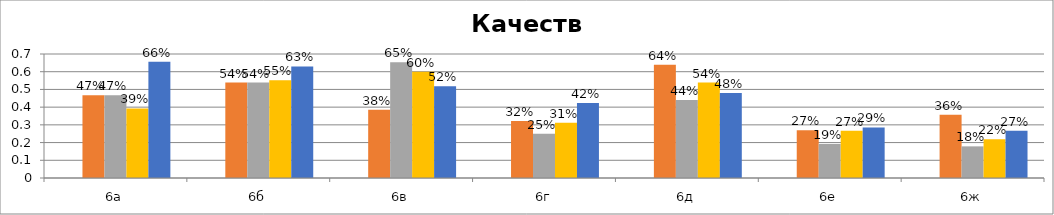
| Category | Series 0 | Series 1 | Series 2 | Series 3 | Series 4 |
|---|---|---|---|---|---|
| 6а |  | 0.467 | 0.467 | 0.393 | 0.656 |
| 6б |  | 0.538 | 0.538 | 0.552 | 0.63 |
| 6в |  | 0.385 | 0.654 | 0.6 | 0.517 |
| 6г |  | 0.321 | 0.25 | 0.312 | 0.423 |
| 6д |  | 0.64 | 0.44 | 0.538 | 0.48 |
| 6е |  | 0.269 | 0.192 | 0.267 | 0.286 |
| 6ж |  | 0.357 | 0.179 | 0.219 | 0.267 |